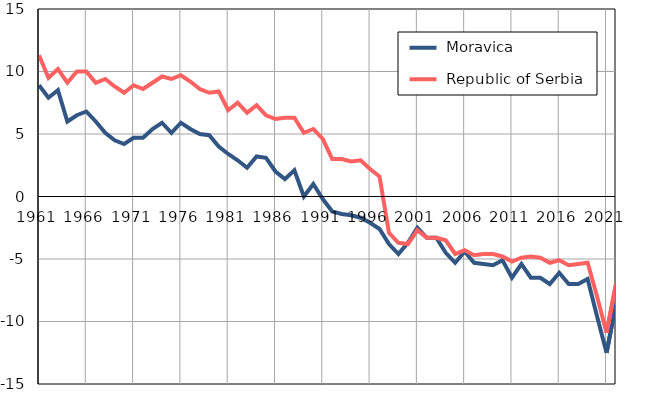
| Category |  Moravica |  Republic of Serbia |
|---|---|---|
| 1961.0 | 8.9 | 11.3 |
| 1962.0 | 7.9 | 9.5 |
| 1963.0 | 8.5 | 10.2 |
| 1964.0 | 6 | 9.1 |
| 1965.0 | 6.5 | 10 |
| 1966.0 | 6.8 | 10 |
| 1967.0 | 6 | 9.1 |
| 1968.0 | 5.1 | 9.4 |
| 1969.0 | 4.5 | 8.8 |
| 1970.0 | 4.2 | 8.3 |
| 1971.0 | 4.7 | 8.9 |
| 1972.0 | 4.7 | 8.6 |
| 1973.0 | 5.4 | 9.1 |
| 1974.0 | 5.9 | 9.6 |
| 1975.0 | 5.1 | 9.4 |
| 1976.0 | 5.9 | 9.7 |
| 1977.0 | 5.4 | 9.2 |
| 1978.0 | 5 | 8.6 |
| 1979.0 | 4.9 | 8.3 |
| 1980.0 | 4 | 8.4 |
| 1981.0 | 3.4 | 6.9 |
| 1982.0 | 2.9 | 7.5 |
| 1983.0 | 2.3 | 6.7 |
| 1984.0 | 3.2 | 7.3 |
| 1985.0 | 3.1 | 6.5 |
| 1986.0 | 2 | 6.2 |
| 1987.0 | 1.4 | 6.3 |
| 1988.0 | 2.1 | 6.3 |
| 1989.0 | 0 | 5.1 |
| 1990.0 | 1 | 5.4 |
| 1991.0 | -0.2 | 4.6 |
| 1992.0 | -1.2 | 3 |
| 1993.0 | -1.4 | 3 |
| 1994.0 | -1.5 | 2.8 |
| 1995.0 | -1.7 | 2.9 |
| 1996.0 | -2.1 | 2.2 |
| 1997.0 | -2.6 | 1.6 |
| 1998.0 | -3.8 | -2.9 |
| 1999.0 | -4.6 | -3.7 |
| 2000.0 | -3.7 | -3.8 |
| 2001.0 | -2.5 | -2.7 |
| 2002.0 | -3.3 | -3.3 |
| 2003.0 | -3.3 | -3.3 |
| 2004.0 | -4.5 | -3.5 |
| 2005.0 | -5.3 | -4.6 |
| 2006.0 | -4.4 | -4.3 |
| 2007.0 | -5.3 | -4.7 |
| 2008.0 | -5.4 | -4.6 |
| 2009.0 | -5.5 | -4.6 |
| 2010.0 | -5.1 | -4.8 |
| 2011.0 | -6.5 | -5.2 |
| 2012.0 | -5.4 | -4.9 |
| 2013.0 | -6.5 | -4.8 |
| 2014.0 | -6.5 | -4.9 |
| 2015.0 | -7 | -5.3 |
| 2016.0 | -6.1 | -5.1 |
| 2017.0 | -7 | -5.5 |
| 2018.0 | -7 | -5.4 |
| 2019.0 | -6.6 | -5.3 |
| 2020.0 | -9.6 | -8 |
| 2021.0 | -12.5 | -10.9 |
| 2022.0 | -8.6 | -7 |